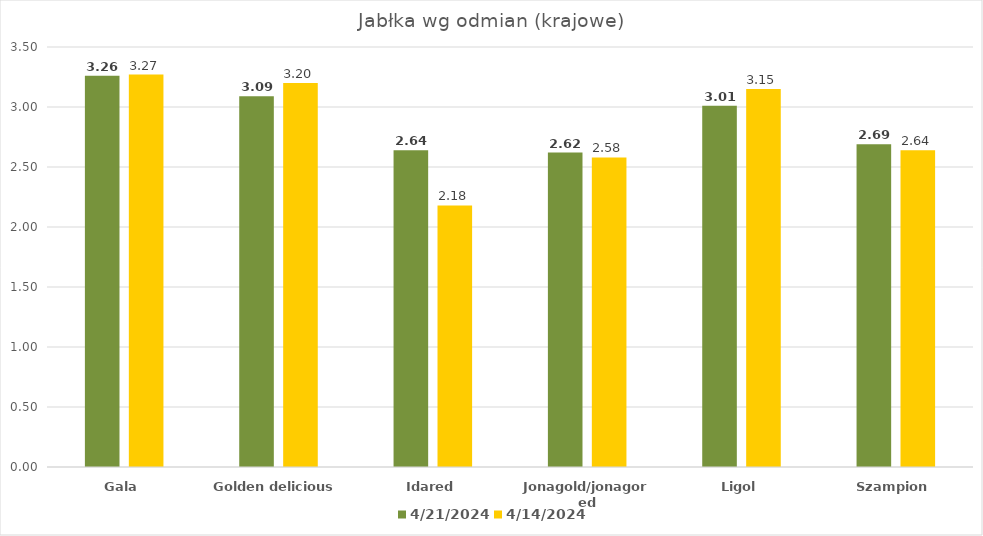
| Category | 2024-04-21 | 2024-04-14 |
|---|---|---|
| Gala | 3.26 | 3.27 |
| Golden delicious | 3.09 | 3.2 |
| Idared | 2.64 | 2.18 |
| Jonagold/jonagored | 2.62 | 2.58 |
| Ligol | 3.01 | 3.15 |
| Szampion | 2.69 | 2.64 |